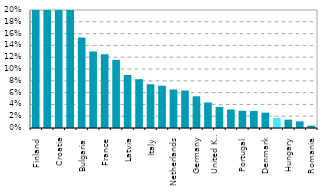
| Category | Series 0 |
|---|---|
| Finland | 0.357 |
| Estonia | 0.351 |
| Croatia | 0.3 |
| Sweden | 0.29 |
| Bulgaria | 0.154 |
| Ireland | 0.13 |
| France | 0.125 |
| Austria | 0.116 |
| Latvia | 0.09 |
| Belgium | 0.083 |
| Italy | 0.074 |
| Poland | 0.072 |
| Netherlands | 0.065 |
| Lithuania | 0.063 |
| Germany | 0.054 |
| Greece | 0.043 |
| United Kingdom | 0.035 |
| Spain | 0.031 |
| Portugal | 0.029 |
| Slovenia | 0.029 |
| Denmark | 0.026 |
| Czechia | 0.017 |
| Hungary | 0.014 |
| Slovakia | 0.011 |
| Romania | 0.004 |